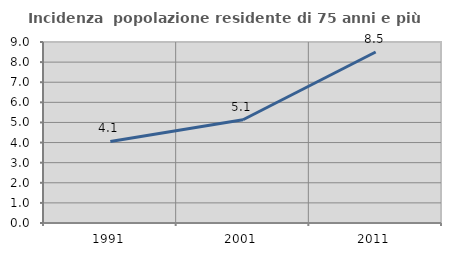
| Category | Incidenza  popolazione residente di 75 anni e più |
|---|---|
| 1991.0 | 4.053 |
| 2001.0 | 5.133 |
| 2011.0 | 8.503 |